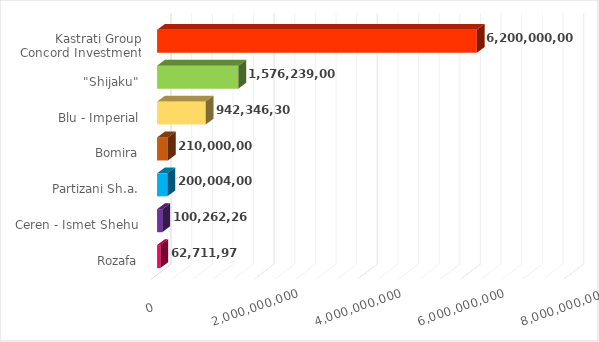
| Category | Investimi (në Lekë) |
|---|---|
| Rozafa | 62711974 |
| Ceren - Ismet Shehu | 100262262 |
| Partizani Sh.a. | 200004000 |
| Bomira | 210000000 |
| Blu - Imperial | 942346300 |
| "Shijaku" | 1576239000 |
| Kastrati Group
Concord Investment | 6200000000 |